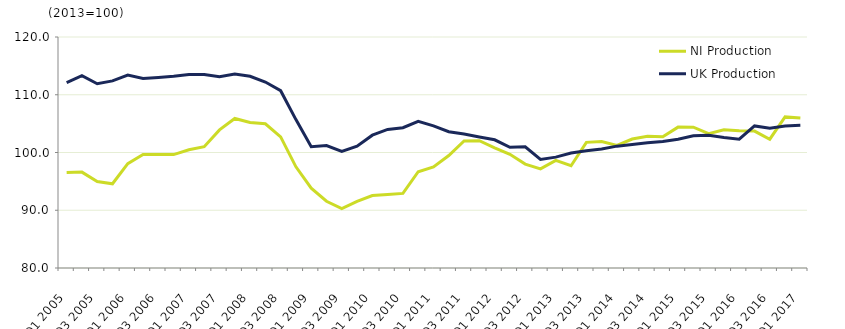
| Category | NI Production | UK Production |
|---|---|---|
| Q1 2005 | 96.521 | 112.1 |
| Q2 2005 | 96.602 | 113.3 |
| Q3 2005 | 94.974 | 111.9 |
| Q4 2005 | 94.585 | 112.4 |
| Q1 2006 | 98.066 | 113.4 |
| Q2 2006 | 99.643 | 112.8 |
| Q3 2006 | 99.675 | 113 |
| Q4 2006 | 99.638 | 113.2 |
| Q1 2007 | 100.466 | 113.5 |
| Q2 2007 | 101.001 | 113.5 |
| Q3 2007 | 103.912 | 113.1 |
| Q4 2007 | 105.898 | 113.6 |
| Q1 2008 | 105.204 | 113.2 |
| Q2 2008 | 104.977 | 112.2 |
| Q3 2008 | 102.706 | 110.7 |
| Q4 2008 | 97.519 | 105.7 |
| Q1 2009 | 93.834 | 101 |
| Q2 2009 | 91.561 | 101.2 |
| Q3 2009 | 90.284 | 100.2 |
| Q4 2009 | 91.547 | 101.1 |
| Q1 2010 | 92.551 | 103 |
| Q2 2010 | 92.73 | 104 |
| Q3 2010 | 92.916 | 104.3 |
| Q4 2010 | 96.673 | 105.4 |
| Q1 2011 | 97.495 | 104.6 |
| Q2 2011 | 99.471 | 103.6 |
| Q3 2011 | 101.994 | 103.2 |
| Q4 2011 | 102.051 | 102.7 |
| Q1 2012 | 100.821 | 102.2 |
| Q2 2012 | 99.68 | 100.9 |
| Q3 2012 | 97.997 | 101 |
| Q4 2012 | 97.169 | 98.8 |
| Q1 2013 | 98.623 | 99.2 |
| Q2 2013 | 97.705 | 99.9 |
| Q3 2013 | 101.76 | 100.3 |
| Q4 2013 | 101.912 | 100.6 |
| Q1 2014 | 101.226 | 101.1 |
| Q2 2014 | 102.334 | 101.4 |
| Q3 2014 | 102.82 | 101.7 |
| Q4 2014 | 102.723 | 101.9 |
| Q1 2015 | 104.395 | 102.3 |
| Q2 2015 | 104.377 | 102.9 |
| Q3 2015 | 103.261 | 103 |
| Q4 2015 | 103.934 | 102.6 |
| Q1 2016 | 103.772 | 102.3 |
| Q2 2016 | 103.706 | 104.6 |
| Q3 2016 | 102.302 | 104.2 |
| Q4 2016 | 106.159 | 104.6 |
| Q1 2017 | 105.969 | 104.7 |